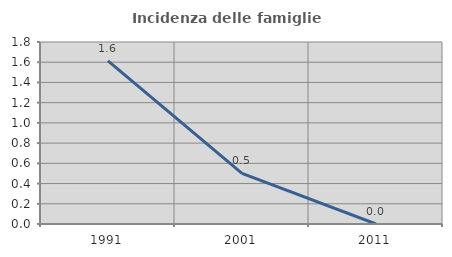
| Category | Incidenza delle famiglie numerose |
|---|---|
| 1991.0 | 1.613 |
| 2001.0 | 0.5 |
| 2011.0 | 0 |